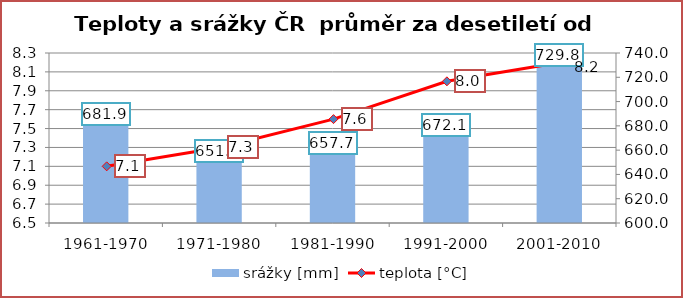
| Category | srážky [mm] |
|---|---|
| 1961-1970 | 681.9 |
| 1971-1980 | 651.4 |
| 1981-1990 | 657.7 |
| 1991-2000 | 672.1 |
| 2001-2010 | 729.8 |